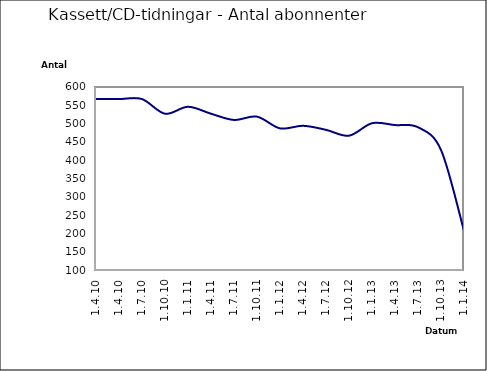
| Category | Series 0 |
|---|---|
| 1.4.10 | 567 |
| 1.4.10 | 567 |
| 1.7.10 | 567 |
| 1.10.10 | 527 |
| 1.1.11 | 546 |
| 1.4.11 | 527 |
| 1.7.11 | 510 |
| 1.10.11 | 519 |
| 1.1.12 | 487 |
| 1.4.12 | 494 |
| 1.7.12 | 483 |
| 1.10.12 | 467 |
| 1.1.13 | 501 |
| 1.4.13 | 496 |
| 1.7.13 | 490 |
| 1.10.13 | 428 |
| 1.1.14 | 207 |